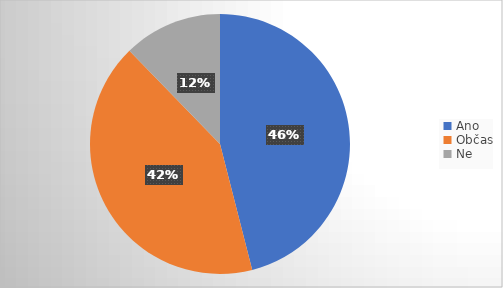
| Category | Series 0 | Series 1 |
|---|---|---|
| Ano | 75 | 0.46 |
| Občas | 68 | 0.417 |
| Ne | 20 | 0.123 |